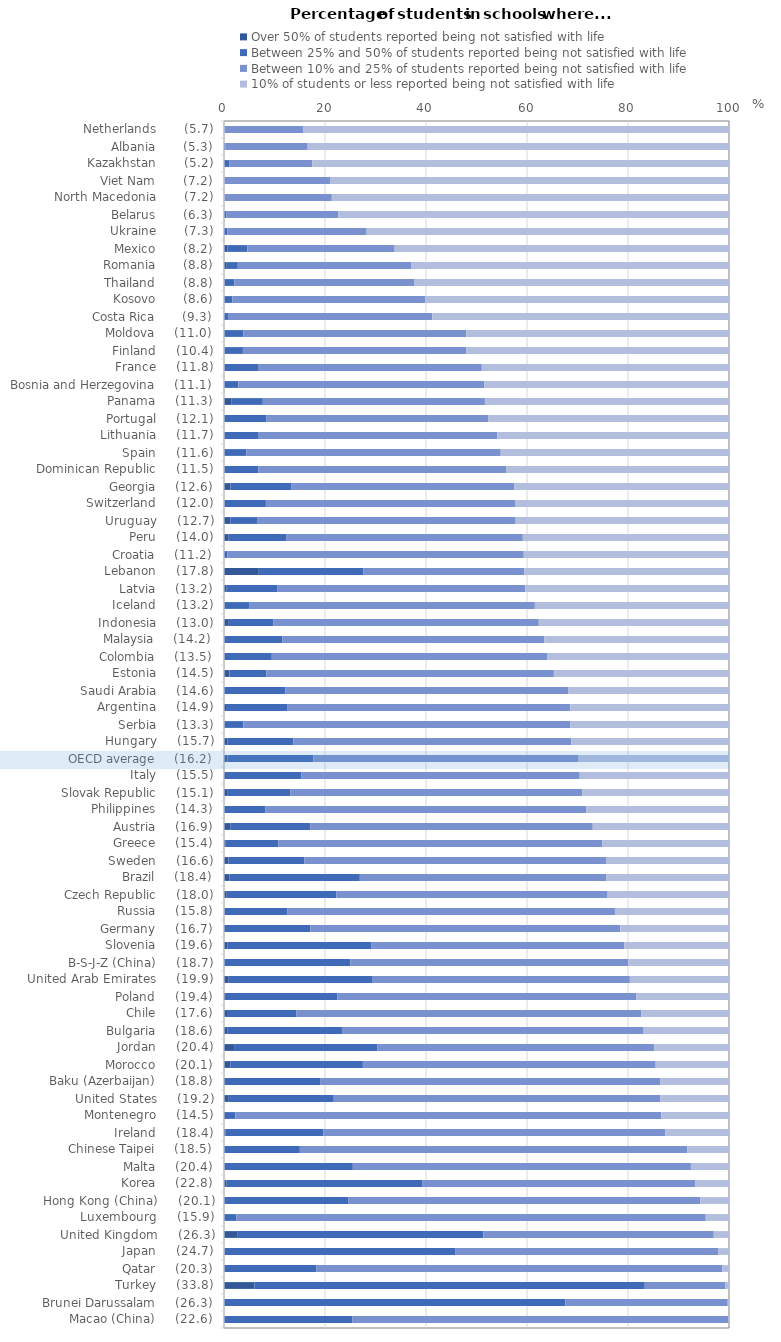
| Category | Over 50% of students reported being not satisfied with life | Between 25% and 50% of students reported being not satisfied with life | Between 10% and 25% of students reported being not satisfied with life | 10% of students or less reported being not satisfied with life |
|---|---|---|---|---|
| Macao (China)     (22.6) | 0 | 25.427 | 74.441 | 0.132 |
| Brunei Darussalam     (26.3) | 0 | 67.6 | 32.146 | 0.254 |
| Turkey     (33.8) | 6.027 | 77.299 | 15.999 | 0.675 |
| Qatar     (20.3) | 0.137 | 18.187 | 80.349 | 1.327 |
| Japan     (24.7) | 0.067 | 45.802 | 52.07 | 2.06 |
| United Kingdom     (26.3) | 2.734 | 48.617 | 45.633 | 3.016 |
| Luxembourg     (15.9) | 0 | 2.462 | 92.938 | 4.6 |
| Hong Kong (China)     (20.1) | 0 | 24.675 | 69.608 | 5.718 |
| Korea     (22.8) | 0.516 | 38.816 | 54.02 | 6.649 |
| Malta     (20.4) | 0.089 | 25.422 | 66.948 | 7.542 |
| Chinese Taipei     (18.5) | 0 | 15.02 | 76.726 | 8.254 |
| Ireland     (18.4) | 0.288 | 19.363 | 67.767 | 12.582 |
| Montenegro     (14.5) | 0.185 | 2.056 | 84.349 | 13.41 |
| United States     (19.2) | 0.951 | 20.79 | 64.637 | 13.622 |
| Baku (Azerbaijan)     (18.8) | 0.373 | 18.648 | 67.334 | 13.645 |
| Morocco     (20.1) | 1.243 | 26.256 | 57.977 | 14.524 |
| Jordan     (20.4) | 2.003 | 28.33 | 54.844 | 14.823 |
| Bulgaria     (18.6) | 0.639 | 22.723 | 59.739 | 16.9 |
| Chile     (17.6) | 0.589 | 13.708 | 68.326 | 17.377 |
| Poland     (19.4) | 0.358 | 22.124 | 59.135 | 18.383 |
| United Arab Emirates     (19.9) | 0.945 | 28.361 | 51.065 | 19.63 |
| B-S-J-Z (China)     (18.7) | 0 | 25.002 | 55.021 | 19.977 |
| Slovenia     (19.6) | 0.647 | 28.482 | 50.159 | 20.713 |
| Germany     (16.7) | 0.188 | 16.901 | 61.378 | 21.533 |
| Russia     (15.8) | 0.098 | 12.478 | 64.839 | 22.585 |
| Czech Republic     (18.0) | 0.543 | 21.69 | 53.726 | 24.041 |
| Brazil     (18.4) | 1.101 | 25.795 | 48.777 | 24.327 |
| Sweden     (16.6) | 0.872 | 15.012 | 59.761 | 24.355 |
| Greece     (15.4) | 0.235 | 10.546 | 64.1 | 25.118 |
| Austria     (16.9) | 1.235 | 15.9 | 55.89 | 26.975 |
| Philippines     (14.3) | 0 | 8.233 | 63.49 | 28.277 |
| Slovak Republic     (15.1) | 0.743 | 12.364 | 57.854 | 29.038 |
| Italy     (15.5) | 0.382 | 14.97 | 55.083 | 29.566 |
| OECD average     (16.2) | 0.668 | 17.044 | 52.505 | 29.784 |
| Hungary     (15.7) | 0.675 | 13.044 | 55.035 | 31.246 |
| Serbia     (13.3) | 0.118 | 3.725 | 64.75 | 31.406 |
| Argentina     (14.9) | 0.399 | 12.212 | 55.953 | 31.435 |
| Saudi Arabia     (14.6) | 0 | 12.111 | 56.114 | 31.775 |
| Estonia     (14.5) | 1.078 | 7.326 | 56.917 | 34.679 |
| Colombia     (13.5) | 0.062 | 9.401 | 54.604 | 35.933 |
| Malaysia     (14.2) | 0 | 11.58 | 51.818 | 36.602 |
| Indonesia     (13.0) | 0.956 | 8.787 | 52.593 | 37.665 |
| Iceland     (13.2) | 0.118 | 4.948 | 56.491 | 38.442 |
| Latvia     (13.2) | 0.447 | 10.071 | 49.15 | 40.332 |
| Lebanon     (17.8) | 6.896 | 20.733 | 31.869 | 40.502 |
| Croatia     (11.2) | 0 | 0.639 | 58.721 | 40.64 |
| Peru     (14.0) | 0.929 | 11.371 | 46.869 | 40.831 |
| Uruguay     (12.7) | 1.243 | 5.301 | 51.209 | 42.247 |
| Switzerland     (12.0) | 0.074 | 8.22 | 49.329 | 42.377 |
| Georgia     (12.6) | 1.253 | 12.033 | 44.16 | 42.555 |
| Dominican Republic     (11.5) | 0.143 | 6.634 | 49.175 | 44.047 |
| Spain     (11.6) | 0.028 | 4.369 | 50.402 | 45.201 |
| Lithuania     (11.7) | 0.131 | 6.597 | 47.406 | 45.865 |
| Portugal     (12.1) | 0.16 | 8.198 | 43.94 | 47.702 |
| Panama     (11.3) | 1.523 | 6.168 | 43.979 | 48.331 |
| Bosnia and Herzegovina     (11.1) | 0.021 | 2.827 | 48.666 | 48.486 |
| France     (11.8) | 0.096 | 6.634 | 44.32 | 48.951 |
| Finland     (10.4) | 0.068 | 3.679 | 44.252 | 52.001 |
| Moldova     (11.0) | 0.014 | 3.796 | 44.178 | 52.013 |
| Costa Rica       (9.3) | 0 | 0.784 | 40.466 | 58.75 |
| Kosovo       (8.6) | 0.049 | 1.62 | 38.206 | 60.126 |
| Thailand       (8.8) | 0.053 | 2.023 | 35.662 | 62.263 |
| Romania       (8.8) | 0.554 | 2.172 | 34.317 | 62.957 |
| Mexico       (8.2) | 0.713 | 3.933 | 29.137 | 66.217 |
| Ukraine       (7.3) | 0 | 0.665 | 27.581 | 71.754 |
| Belarus       (6.3) | 0 | 0.432 | 22.174 | 77.394 |
| North Macedonia       (7.2) | 0 | 0 | 21.348 | 78.652 |
| Viet Nam       (7.2) | 0 | 0.038 | 20.957 | 79.005 |
| Kazakhstan       (5.2) | 0 | 1.019 | 16.455 | 82.526 |
| Albania       (5.3) | 0.026 | 0.272 | 16.276 | 83.427 |
| Netherlands       (5.7) | 0 | 0.042 | 15.701 | 84.257 |